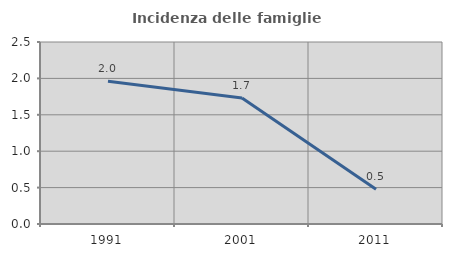
| Category | Incidenza delle famiglie numerose |
|---|---|
| 1991.0 | 1.961 |
| 2001.0 | 1.732 |
| 2011.0 | 0.476 |